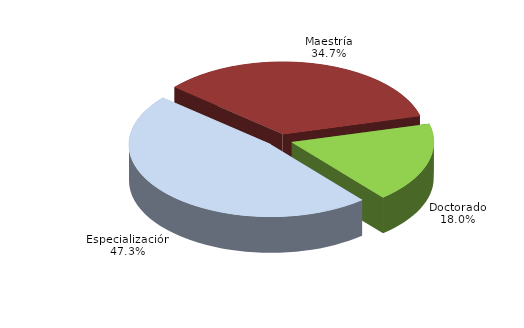
| Category | Series 0 |
|---|---|
| Especialización | 14372 |
| Maestría | 10530 |
| Doctorado | 5461 |